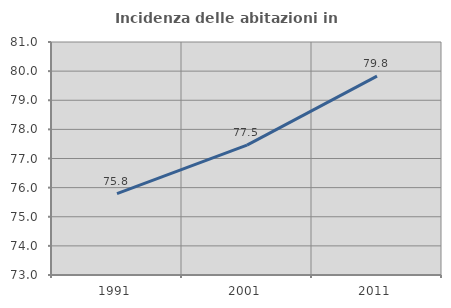
| Category | Incidenza delle abitazioni in proprietà  |
|---|---|
| 1991.0 | 75.797 |
| 2001.0 | 77.46 |
| 2011.0 | 79.83 |